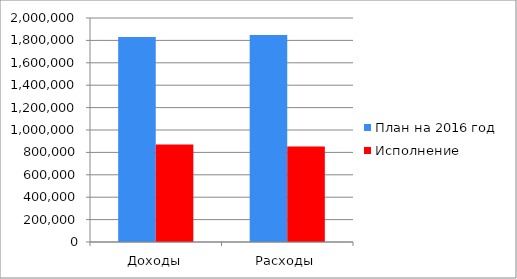
| Category | План на 2016 год | Исполнение |
|---|---|---|
| Доходы | 1830649 | 870859 |
| Расходы | 1847905 | 853740 |